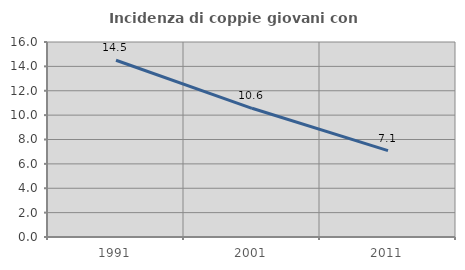
| Category | Incidenza di coppie giovani con figli |
|---|---|
| 1991.0 | 14.5 |
| 2001.0 | 10.56 |
| 2011.0 | 7.086 |